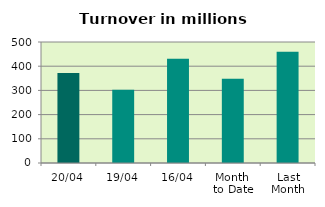
| Category | Series 0 |
|---|---|
| 20/04 | 371.783 |
| 19/04 | 302.414 |
| 16/04 | 431.261 |
| Month 
to Date | 347.763 |
| Last
Month | 459.546 |